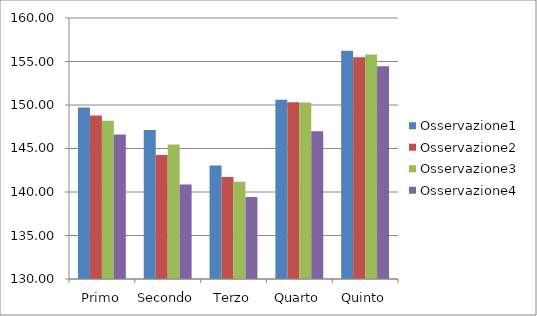
| Category | Osservazione1 | Osservazione2 | Osservazione3 | Osservazione4 |
|---|---|---|---|---|
| Primo | 149.703 | 148.788 | 148.193 | 146.615 |
| Secondo | 147.134 | 144.262 | 145.455 | 140.85 |
| Terzo | 143.046 | 141.725 | 141.176 | 139.437 |
| Quarto | 150.595 | 150.302 | 150.299 | 146.988 |
| Quinto | 156.233 | 155.495 | 155.817 | 154.457 |